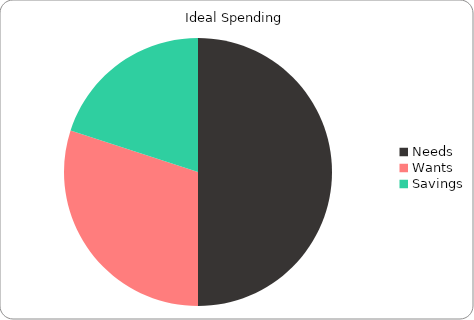
| Category | Series 0 |
|---|---|
| Needs | 50 |
| Wants | 30 |
| Savings | 20 |